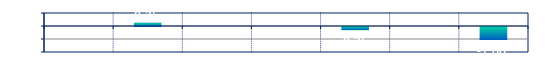
| Category | Series 0 |
|---|---|
| 0 | 0 |
| 1 | 0.25 |
| 2 | 0 |
| 3 | 0 |
| 4 | -0.25 |
| 5 | 0 |
| 6 | -1 |